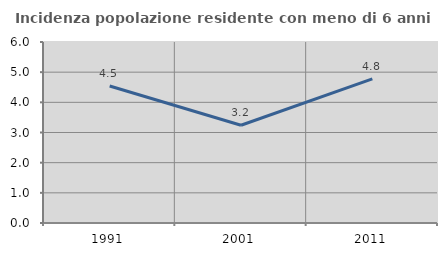
| Category | Incidenza popolazione residente con meno di 6 anni |
|---|---|
| 1991.0 | 4.542 |
| 2001.0 | 3.241 |
| 2011.0 | 4.778 |